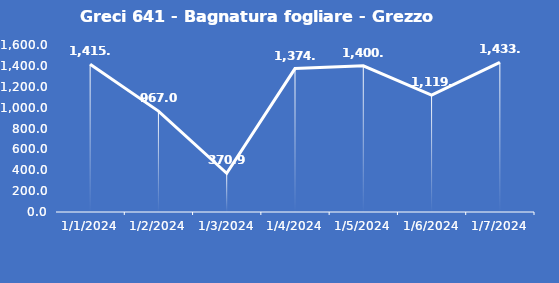
| Category | Greci 641 - Bagnatura fogliare - Grezzo (min) |
|---|---|
| 1/1/24 | 1415.2 |
| 1/2/24 | 967 |
| 1/3/24 | 370.9 |
| 1/4/24 | 1374 |
| 1/5/24 | 1400 |
| 1/6/24 | 1119.1 |
| 1/7/24 | 1433.7 |